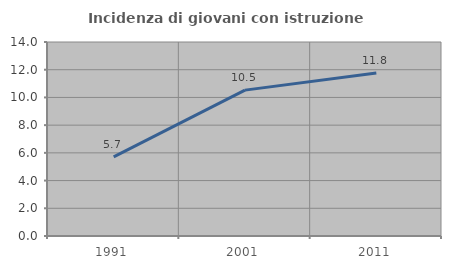
| Category | Incidenza di giovani con istruzione universitaria |
|---|---|
| 1991.0 | 5.714 |
| 2001.0 | 10.526 |
| 2011.0 | 11.765 |